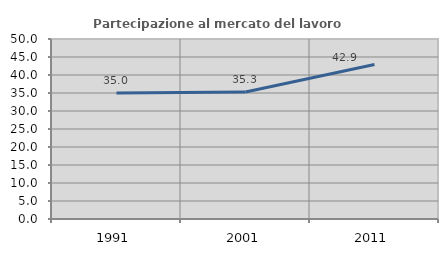
| Category | Partecipazione al mercato del lavoro  femminile |
|---|---|
| 1991.0 | 34.975 |
| 2001.0 | 35.294 |
| 2011.0 | 42.892 |